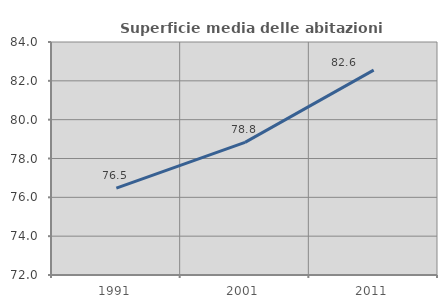
| Category | Superficie media delle abitazioni occupate |
|---|---|
| 1991.0 | 76.474 |
| 2001.0 | 78.829 |
| 2011.0 | 82.552 |